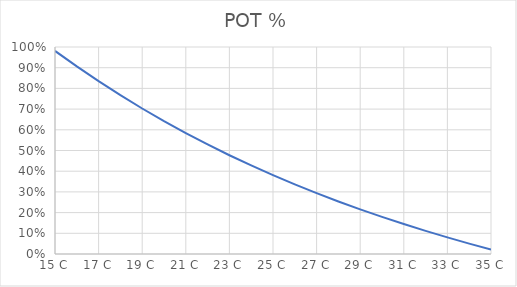
| Category | POT % |
|---|---|
| 15.0 | 0.981 |
| 16.0 | 0.906 |
| 17.0 | 0.835 |
| 18.0 | 0.767 |
| 19.0 | 0.703 |
| 20.0 | 0.642 |
| 21.0 | 0.584 |
| 22.0 | 0.529 |
| 23.0 | 0.477 |
| 24.0 | 0.428 |
| 25.0 | 0.381 |
| 26.0 | 0.336 |
| 27.0 | 0.294 |
| 28.0 | 0.254 |
| 29.0 | 0.216 |
| 30.0 | 0.179 |
| 31.0 | 0.145 |
| 32.0 | 0.112 |
| 33.0 | 0.08 |
| 34.0 | 0.05 |
| 35.0 | 0.022 |